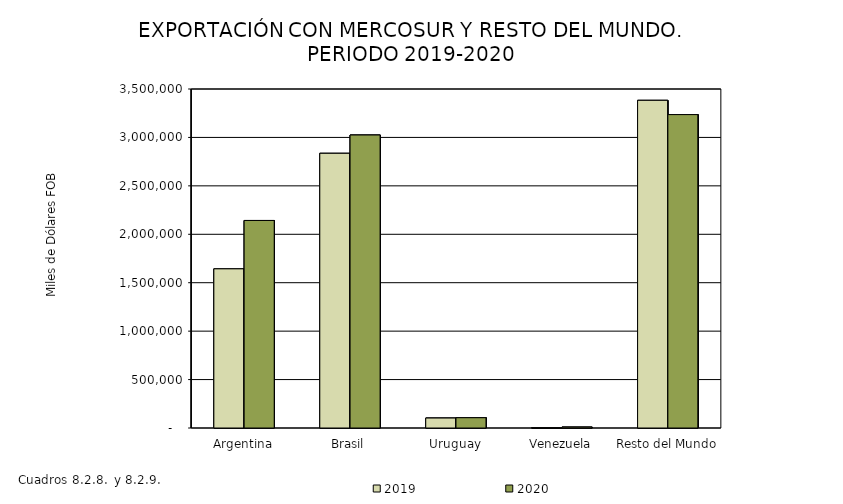
| Category | 2019 | 2020 |
|---|---|---|
| Argentina | 1643254.75 | 2142610.706 |
| Brasil | 2836144.001 | 3024792.865 |
| Uruguay | 102916.441 | 105996.098 |
| Venezuela | 2496.024 | 9660.523 |
| Resto del Mundo | 3382994.107 | 3235727.189 |